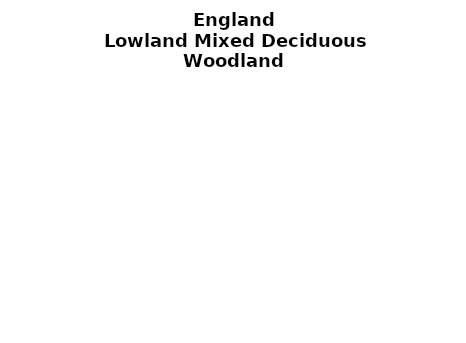
| Category | Lowland Mixed Deciduous Woodland |
|---|---|
| None | 0.063 |
| Seedlings only | 0 |
| Seedlings, saplings only | 0.047 |
| Seedlings, saplings, <7 cm trees | 0.202 |
| Saplings only | 0.159 |
| <7 cm trees, seedlings only | 0 |
| <7 cm trees, saplings only | 0.45 |
| <7 cm Trees only | 0.079 |